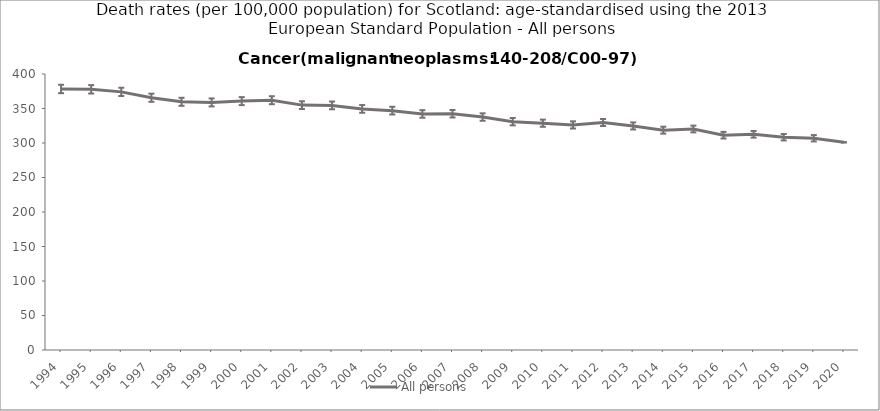
| Category | All persons |
|---|---|
| 1994.0 | 378.3 |
| 1995.0 | 377.8 |
| 1996.0 | 374.1 |
| 1997.0 | 365.6 |
| 1998.0 | 359.7 |
| 1999.0 | 358.8 |
| 2000.0 | 360.7 |
| 2001.0 | 362 |
| 2002.0 | 354.9 |
| 2003.0 | 354.5 |
| 2004.0 | 349.4 |
| 2005.0 | 346.9 |
| 2006.0 | 342.1 |
| 2007.0 | 342.4 |
| 2008.0 | 337.6 |
| 2009.0 | 330.9 |
| 2010.0 | 328.7 |
| 2011.0 | 326.2 |
| 2012.0 | 329.7 |
| 2013.0 | 324.7 |
| 2014.0 | 318.6 |
| 2015.0 | 320.3 |
| 2016.0 | 311.3 |
| 2017.0 | 312.6 |
| 2018.0 | 308.4 |
| 2019.0 | 306.9 |
| 2020.0 | 301 |